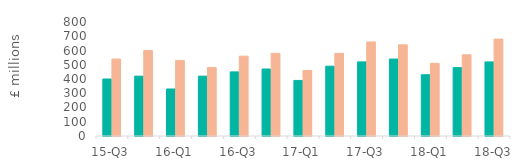
| Category | First-time
buyers | Home movers |
|---|---|---|
| 15-Q3 | 400 | 540 |
| 15-Q4 | 420 | 600 |
| 16-Q1 | 330 | 530 |
| 16-Q2 | 420 | 480 |
| 16-Q3 | 450 | 560 |
| 16-Q4 | 470 | 580 |
| 17-Q1 | 390 | 460 |
| 17-Q2 | 490 | 580 |
| 17-Q3 | 520 | 660 |
| 17-Q4 | 540 | 640 |
| 18-Q1 | 430 | 510 |
| 18-Q2 | 480 | 570 |
| 18-Q3 | 520 | 680 |